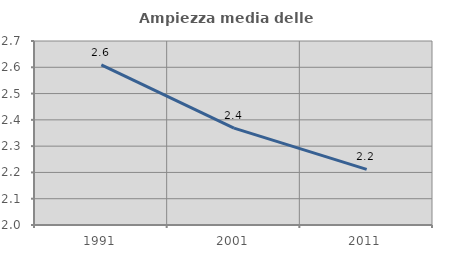
| Category | Ampiezza media delle famiglie |
|---|---|
| 1991.0 | 2.609 |
| 2001.0 | 2.368 |
| 2011.0 | 2.212 |